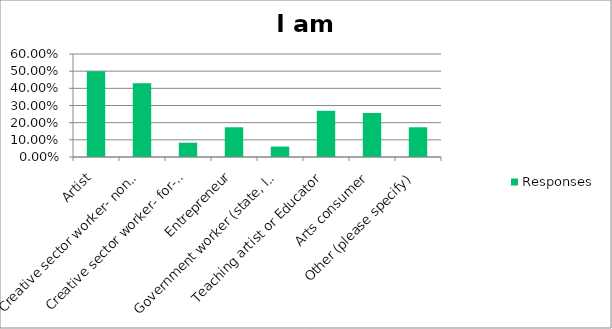
| Category | Responses |
|---|---|
| Artist | 0.5 |
| Creative sector worker- nonprofit | 0.43 |
| Creative sector worker- for-profit | 0.083 |
| Entrepreneur | 0.173 |
| Government worker (state, local, other) | 0.061 |
| Teaching artist or Educator | 0.269 |
| Arts consumer | 0.256 |
| Other (please specify) | 0.173 |